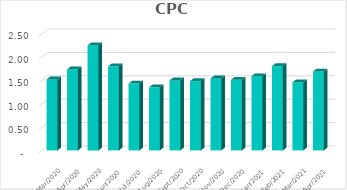
| Category | CPC |
|---|---|
| 2021-04-30 | 1.687 |
| 2021-03-31 | 1.456 |
| 2021-02-28 | 1.801 |
| 2021-01-31 | 1.585 |
| 2020-12-31 | 1.508 |
| 2020-11-30 | 1.538 |
| 2020-10-31 | 1.48 |
| 2020-09-30 | 1.496 |
| 2020-08-31 | 1.347 |
| 2020-07-31 | 1.427 |
| 2020-06-30 | 1.796 |
| 2020-05-31 | 2.244 |
| 2020-04-30 | 1.733 |
| 2020-03-31 | 1.517 |